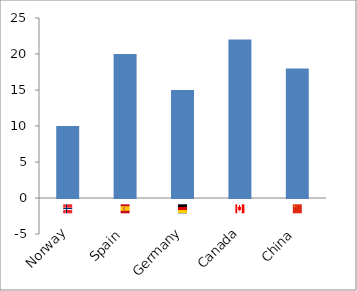
| Category | Value |
|---|---|
| Norway | 10 |
| Spain | 20 |
| Germany | 15 |
| Canada | 22 |
| China | 18 |